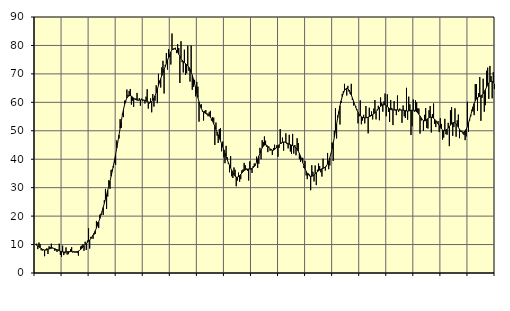
| Category | Piggar | Series 1 |
|---|---|---|
| nan | 10 | 10.13 |
| 87.0 | 10.3 | 9.76 |
| 87.0 | 8.4 | 9.48 |
| 87.0 | 10.7 | 9.19 |
| 87.0 | 10.2 | 8.9 |
| 87.0 | 8 | 8.61 |
| 87.0 | 7.9 | 8.34 |
| 87.0 | 8.3 | 8.14 |
| 87.0 | 5.9 | 8.05 |
| 87.0 | 8.3 | 8.05 |
| 87.0 | 8.7 | 8.14 |
| 87.0 | 6.7 | 8.28 |
| nan | 9.4 | 8.45 |
| 88.0 | 9.1 | 8.61 |
| 88.0 | 10.3 | 8.71 |
| 88.0 | 8.9 | 8.75 |
| 88.0 | 8.6 | 8.69 |
| 88.0 | 7.8 | 8.56 |
| 88.0 | 8 | 8.38 |
| 88.0 | 7.4 | 8.18 |
| 88.0 | 8.2 | 7.98 |
| 88.0 | 10.3 | 7.8 |
| 88.0 | 6.4 | 7.63 |
| 88.0 | 5.7 | 7.51 |
| nan | 9.6 | 7.43 |
| 89.0 | 6.3 | 7.39 |
| 89.0 | 6.9 | 7.38 |
| 89.0 | 9 | 7.41 |
| 89.0 | 6.5 | 7.46 |
| 89.0 | 6.6 | 7.52 |
| 89.0 | 7.3 | 7.55 |
| 89.0 | 8.4 | 7.55 |
| 89.0 | 9.1 | 7.53 |
| 89.0 | 7.2 | 7.47 |
| 89.0 | 7.7 | 7.43 |
| 89.0 | 7.2 | 7.43 |
| nan | 7.2 | 7.46 |
| 90.0 | 7.1 | 7.54 |
| 90.0 | 6.1 | 7.7 |
| 90.0 | 8 | 7.95 |
| 90.0 | 9.3 | 8.28 |
| 90.0 | 9.6 | 8.69 |
| 90.0 | 10.1 | 9.15 |
| 90.0 | 7.8 | 9.61 |
| 90.0 | 11 | 10.03 |
| 90.0 | 8.1 | 10.42 |
| 90.0 | 11.4 | 10.79 |
| 90.0 | 15.7 | 11.17 |
| nan | 8.6 | 11.58 |
| 91.0 | 12.7 | 12.07 |
| 91.0 | 12.7 | 12.64 |
| 91.0 | 12 | 13.3 |
| 91.0 | 13.5 | 14.05 |
| 91.0 | 13.8 | 14.9 |
| 91.0 | 18.3 | 15.83 |
| 91.0 | 17.8 | 16.86 |
| 91.0 | 15.8 | 17.98 |
| 91.0 | 20.5 | 19.17 |
| 91.0 | 20.8 | 20.41 |
| 91.0 | 21.6 | 21.71 |
| nan | 20.4 | 23.07 |
| 92.0 | 25.6 | 24.5 |
| 92.0 | 29.6 | 25.98 |
| 92.0 | 22.5 | 27.51 |
| 92.0 | 26.9 | 29.07 |
| 92.0 | 32.6 | 30.67 |
| 92.0 | 29.6 | 32.3 |
| 92.0 | 36.2 | 34 |
| 92.0 | 36.5 | 35.78 |
| 92.0 | 37.1 | 37.66 |
| 92.0 | 38.8 | 39.63 |
| 92.0 | 38 | 41.7 |
| nan | 46.6 | 43.88 |
| 93.0 | 46.1 | 46.15 |
| 93.0 | 47.3 | 48.49 |
| 93.0 | 54.1 | 50.86 |
| 93.0 | 51 | 53.24 |
| 93.0 | 56 | 55.5 |
| 93.0 | 54.8 | 57.53 |
| 93.0 | 60.6 | 59.25 |
| 93.0 | 60.2 | 60.59 |
| 93.0 | 64.5 | 61.52 |
| 93.0 | 62.6 | 62.1 |
| 93.0 | 64 | 62.36 |
| nan | 64.7 | 62.37 |
| 94.0 | 59.2 | 62.17 |
| 94.0 | 60.6 | 61.86 |
| 94.0 | 58.4 | 61.51 |
| 94.0 | 61.1 | 61.17 |
| 94.0 | 61.4 | 60.92 |
| 94.0 | 63.3 | 60.78 |
| 94.0 | 60.6 | 60.75 |
| 94.0 | 61.5 | 60.79 |
| 94.0 | 58.8 | 60.85 |
| 94.0 | 61.3 | 60.89 |
| 94.0 | 60.4 | 60.89 |
| nan | 60.7 | 60.81 |
| 95.0 | 59.6 | 60.67 |
| 95.0 | 62 | 60.49 |
| 95.0 | 64.6 | 60.28 |
| 95.0 | 57.8 | 60.12 |
| 95.0 | 59.6 | 60.02 |
| 95.0 | 61.4 | 60.02 |
| 95.0 | 56.5 | 60.22 |
| 95.0 | 62.9 | 60.67 |
| 95.0 | 58.5 | 61.37 |
| 95.0 | 60.6 | 62.31 |
| 95.0 | 66 | 63.41 |
| nan | 59.7 | 64.62 |
| 96.0 | 70 | 65.9 |
| 96.0 | 67.6 | 67.15 |
| 96.0 | 65.2 | 68.33 |
| 96.0 | 72.3 | 69.43 |
| 96.0 | 74.6 | 70.49 |
| 96.0 | 63.1 | 71.54 |
| 96.0 | 73.2 | 72.59 |
| 96.0 | 77.3 | 73.65 |
| 96.0 | 71.5 | 74.76 |
| 96.0 | 78.7 | 75.86 |
| 96.0 | 75.9 | 76.88 |
| nan | 73.3 | 77.75 |
| 97.0 | 84.2 | 78.4 |
| 97.0 | 78.5 | 78.78 |
| 97.0 | 78.7 | 78.89 |
| 97.0 | 79.2 | 78.71 |
| 97.0 | 77.3 | 78.26 |
| 97.0 | 80.5 | 77.65 |
| 97.0 | 79.1 | 76.93 |
| 97.0 | 66.8 | 76.16 |
| 97.0 | 81.5 | 75.44 |
| 97.0 | 74.1 | 74.83 |
| 97.0 | 70.5 | 74.34 |
| nan | 78.5 | 73.96 |
| 98.0 | 69.6 | 73.61 |
| 98.0 | 70.2 | 73.26 |
| 98.0 | 79.9 | 72.85 |
| 98.0 | 71.1 | 72.33 |
| 98.0 | 67.3 | 71.62 |
| 98.0 | 80 | 70.69 |
| 98.0 | 64.4 | 69.52 |
| 98.0 | 65.4 | 68.15 |
| 98.0 | 67.9 | 66.61 |
| 98.0 | 62.1 | 64.95 |
| 98.0 | 67.2 | 63.27 |
| nan | 65.5 | 61.65 |
| 99.0 | 53.2 | 60.16 |
| 99.0 | 58.7 | 58.9 |
| 99.0 | 59.3 | 57.87 |
| 99.0 | 56.7 | 57.1 |
| 99.0 | 53.6 | 56.6 |
| 99.0 | 57 | 56.3 |
| 99.0 | 57.3 | 56.11 |
| 99.0 | 55.7 | 55.98 |
| 99.0 | 55.1 | 55.77 |
| 99.0 | 56.5 | 55.41 |
| 99.0 | 57 | 54.87 |
| nan | 53.6 | 54.17 |
| 0.0 | 54.8 | 53.36 |
| 0.0 | 54.6 | 52.49 |
| 0.0 | 45 | 51.53 |
| 0.0 | 52.9 | 50.53 |
| 0.0 | 48.3 | 49.54 |
| 0.0 | 45.7 | 48.53 |
| 0.0 | 50.6 | 47.52 |
| 0.0 | 50.9 | 46.51 |
| 0.0 | 42.8 | 45.47 |
| 0.0 | 46.2 | 44.39 |
| 0.0 | 40.7 | 43.27 |
| nan | 38.6 | 42.12 |
| 1.0 | 44.7 | 40.98 |
| 1.0 | 40.7 | 39.86 |
| 1.0 | 38.4 | 38.81 |
| 1.0 | 35.4 | 37.85 |
| 1.0 | 41.1 | 36.93 |
| 1.0 | 34 | 36.08 |
| 1.0 | 33.4 | 35.29 |
| 1.0 | 37.1 | 34.58 |
| 1.0 | 36.3 | 34.04 |
| 1.0 | 30.5 | 33.74 |
| 1.0 | 32.5 | 33.68 |
| nan | 35.3 | 33.86 |
| 2.0 | 32.1 | 34.21 |
| 2.0 | 33 | 34.65 |
| 2.0 | 36.1 | 35.14 |
| 2.0 | 36.4 | 35.6 |
| 2.0 | 38.7 | 35.99 |
| 2.0 | 37.9 | 36.26 |
| 2.0 | 36.7 | 36.45 |
| 2.0 | 35.9 | 36.55 |
| 2.0 | 32.5 | 36.57 |
| 2.0 | 39.2 | 36.58 |
| 2.0 | 36.4 | 36.63 |
| nan | 35.2 | 36.76 |
| 3.0 | 37.6 | 37.02 |
| 3.0 | 38.5 | 37.47 |
| 3.0 | 37.8 | 38.13 |
| 3.0 | 40.9 | 38.98 |
| 3.0 | 36.9 | 39.96 |
| 3.0 | 38.4 | 41.03 |
| 3.0 | 44 | 42.11 |
| 3.0 | 40 | 43.13 |
| 3.0 | 46.7 | 44 |
| 3.0 | 46 | 44.63 |
| 3.0 | 48 | 44.97 |
| nan | 46.5 | 45.05 |
| 4.0 | 44.4 | 44.91 |
| 4.0 | 42.5 | 44.57 |
| 4.0 | 44.4 | 44.11 |
| 4.0 | 43 | 43.64 |
| 4.0 | 43.6 | 43.28 |
| 4.0 | 41.5 | 43.13 |
| 4.0 | 43.9 | 43.18 |
| 4.0 | 45.1 | 43.42 |
| 4.0 | 43.6 | 43.8 |
| 4.0 | 44.9 | 44.25 |
| 4.0 | 40.9 | 44.7 |
| nan | 44 | 45.13 |
| 5.0 | 50.6 | 45.5 |
| 5.0 | 45.5 | 45.78 |
| 5.0 | 47.6 | 45.96 |
| 5.0 | 43 | 46.04 |
| 5.0 | 46.1 | 46.02 |
| 5.0 | 49.1 | 45.89 |
| 5.0 | 45.3 | 45.7 |
| 5.0 | 43.8 | 45.48 |
| 5.0 | 48.6 | 45.27 |
| 5.0 | 42.7 | 45.1 |
| 5.0 | 41.9 | 44.95 |
| nan | 48.9 | 44.81 |
| 6.0 | 42 | 44.6 |
| 6.0 | 45 | 44.31 |
| 6.0 | 41.4 | 43.93 |
| 6.0 | 47.4 | 43.43 |
| 6.0 | 45.7 | 42.82 |
| 6.0 | 40 | 42.03 |
| 6.0 | 39.1 | 41.07 |
| 6.0 | 39.8 | 39.99 |
| 6.0 | 40.5 | 38.85 |
| 6.0 | 36.9 | 37.71 |
| 6.0 | 39.4 | 36.68 |
| nan | 34.3 | 35.77 |
| 7.0 | 33 | 35 |
| 7.0 | 35 | 34.45 |
| 7.0 | 34.6 | 34.12 |
| 7.0 | 29.1 | 33.98 |
| 7.0 | 37.9 | 33.99 |
| 7.0 | 35.6 | 34.17 |
| 7.0 | 32.2 | 34.48 |
| 7.0 | 37.8 | 34.85 |
| 7.0 | 30.9 | 35.23 |
| 7.0 | 36.3 | 35.6 |
| 7.0 | 38.5 | 35.93 |
| nan | 37.6 | 36.19 |
| 8.0 | 35.4 | 36.43 |
| 8.0 | 33.9 | 36.64 |
| 8.0 | 40.2 | 36.8 |
| 8.0 | 37.2 | 36.99 |
| 8.0 | 36 | 37.28 |
| 8.0 | 37.5 | 37.7 |
| 8.0 | 42.2 | 38.36 |
| 8.0 | 36.5 | 39.3 |
| 8.0 | 37.8 | 40.5 |
| 8.0 | 42.1 | 41.99 |
| 8.0 | 45.9 | 43.7 |
| nan | 39.4 | 45.62 |
| 9.0 | 50 | 47.74 |
| 9.0 | 57.9 | 49.99 |
| 9.0 | 47.3 | 52.31 |
| 9.0 | 55.4 | 54.6 |
| 9.0 | 56 | 56.77 |
| 9.0 | 52.2 | 58.77 |
| 9.0 | 59.8 | 60.53 |
| 9.0 | 63 | 62.03 |
| 9.0 | 64 | 63.25 |
| 9.0 | 66.5 | 64.15 |
| 9.0 | 64.5 | 64.72 |
| nan | 62.4 | 64.95 |
| 10.0 | 65.8 | 64.82 |
| 10.0 | 63.8 | 64.33 |
| 10.0 | 63 | 63.55 |
| 10.0 | 66.5 | 62.61 |
| 10.0 | 60.8 | 61.56 |
| 10.0 | 58.9 | 60.45 |
| 10.0 | 59.2 | 59.32 |
| 10.0 | 58.7 | 58.26 |
| 10.0 | 57.6 | 57.3 |
| 10.0 | 52.6 | 56.46 |
| 10.0 | 55.1 | 55.77 |
| nan | 60.7 | 55.27 |
| 11.0 | 52.3 | 54.94 |
| 11.0 | 53.6 | 54.72 |
| 11.0 | 55.6 | 54.61 |
| 11.0 | 52.6 | 54.57 |
| 11.0 | 58.7 | 54.58 |
| 11.0 | 54.8 | 54.65 |
| 11.0 | 49.1 | 54.78 |
| 11.0 | 58.1 | 54.93 |
| 11.0 | 55.5 | 55.13 |
| 11.0 | 56.8 | 55.38 |
| 11.0 | 54 | 55.66 |
| nan | 57.8 | 55.97 |
| 12.0 | 60.8 | 56.31 |
| 12.0 | 54 | 56.71 |
| 12.0 | 57.5 | 57.17 |
| 12.0 | 58.8 | 57.66 |
| 12.0 | 53.7 | 58.13 |
| 12.0 | 61.7 | 58.56 |
| 12.0 | 59.9 | 58.91 |
| 12.0 | 56.7 | 59.14 |
| 12.0 | 60.3 | 59.2 |
| 12.0 | 63.1 | 59.09 |
| 12.0 | 55.1 | 58.83 |
| nan | 62.8 | 58.49 |
| 13.0 | 56.6 | 58.11 |
| 13.0 | 53.1 | 57.76 |
| 13.0 | 60.8 | 57.51 |
| 13.0 | 58 | 57.36 |
| 13.0 | 52 | 57.33 |
| 13.0 | 60.4 | 57.35 |
| 13.0 | 57.1 | 57.38 |
| 13.0 | 55.5 | 57.38 |
| 13.0 | 62.4 | 57.34 |
| 13.0 | 56.7 | 57.29 |
| 13.0 | 57.8 | 57.28 |
| nan | 57.4 | 57.29 |
| 14.0 | 52.8 | 57.28 |
| 14.0 | 58.9 | 57.26 |
| 14.0 | 55.1 | 57.2 |
| 14.0 | 54.5 | 57.09 |
| 14.0 | 65.1 | 56.98 |
| 14.0 | 53.9 | 56.95 |
| 14.0 | 62 | 56.98 |
| 14.0 | 59.3 | 57.06 |
| 14.0 | 48.5 | 57.18 |
| 14.0 | 51.6 | 57.26 |
| 14.0 | 61 | 57.26 |
| nan | 56.7 | 57.17 |
| 15.0 | 60.7 | 56.99 |
| 15.0 | 60 | 56.71 |
| 15.0 | 57.9 | 56.29 |
| 15.0 | 57.8 | 55.77 |
| 15.0 | 49 | 55.18 |
| 15.0 | 53.6 | 54.55 |
| 15.0 | 54.1 | 53.99 |
| 15.0 | 50 | 53.6 |
| 15.0 | 55.6 | 53.47 |
| 15.0 | 58 | 53.61 |
| 15.0 | 51 | 53.93 |
| nan | 50.8 | 54.29 |
| 16.0 | 57.2 | 54.58 |
| 16.0 | 58.7 | 54.76 |
| 16.0 | 49.4 | 54.79 |
| 16.0 | 55.9 | 54.67 |
| 16.0 | 59.6 | 54.4 |
| 16.0 | 52.4 | 54.03 |
| 16.0 | 51.3 | 53.55 |
| 16.0 | 52.9 | 53.01 |
| 16.0 | 53.4 | 52.43 |
| 16.0 | 49.6 | 51.77 |
| 16.0 | 54.4 | 51.15 |
| nan | 52.4 | 50.65 |
| 17.0 | 46.9 | 50.29 |
| 17.0 | 47.6 | 50.08 |
| 17.0 | 54.2 | 50.07 |
| 17.0 | 48.8 | 50.24 |
| 17.0 | 48.6 | 50.54 |
| 17.0 | 52.8 | 50.96 |
| 17.0 | 44.6 | 51.48 |
| 17.0 | 57.2 | 52.01 |
| 17.0 | 58.3 | 52.47 |
| 17.0 | 48.2 | 52.8 |
| 17.0 | 51.3 | 52.93 |
| nan | 57.9 | 52.8 |
| 18.0 | 47.9 | 52.43 |
| 18.0 | 53.7 | 51.88 |
| 18.0 | 55.7 | 51.22 |
| 18.0 | 47.4 | 50.54 |
| 18.0 | 49.7 | 49.97 |
| 18.0 | 50 | 49.61 |
| 18.0 | 49 | 49.47 |
| 18.0 | 48.5 | 49.57 |
| 18.0 | 46.7 | 49.93 |
| 18.0 | 48 | 50.58 |
| 18.0 | 60.2 | 51.52 |
| nan | 49.7 | 52.71 |
| 19.0 | 53.6 | 54.09 |
| 19.0 | 55.1 | 55.56 |
| 19.0 | 57.4 | 57.01 |
| 19.0 | 56.8 | 58.4 |
| 19.0 | 55.5 | 59.61 |
| 19.0 | 66.4 | 60.54 |
| 19.0 | 66.4 | 61.21 |
| 19.0 | 57 | 61.64 |
| 19.0 | 63.2 | 61.89 |
| 19.0 | 68.9 | 62.1 |
| 19.0 | 53.5 | 62.3 |
| nan | 61.6 | 62.59 |
| 20.0 | 68.3 | 63.06 |
| 20.0 | 56.7 | 63.72 |
| 20.0 | 59 | 64.51 |
| 20.0 | 71.1 | 65.35 |
| 20.0 | 72.2 | 66.16 |
| 20.0 | 61.2 | 66.81 |
| 20.0 | 72.8 | 67.22 |
| 20.0 | 69.2 | 67.37 |
| 20.0 | 61.4 | 67.28 |
| 20.0 | 70.6 | 66.96 |
| 20.0 | 64.7 | 66.48 |